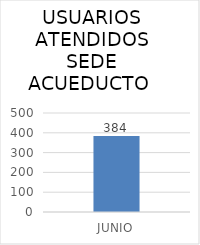
| Category | Series 0 |
|---|---|
| JUNIO | 384 |